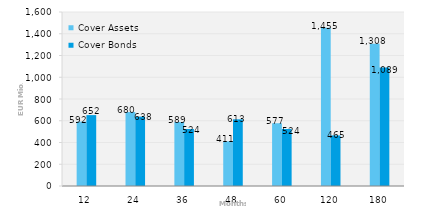
| Category | Cover Assets | Cover Bonds |
|---|---|---|
| 12.0 | 592.052 | 651.8 |
| 24.0 | 680.169 | 637.757 |
| 36.0 | 588.728 | 524.316 |
| 48.0 | 410.767 | 613.159 |
| 60.0 | 576.97 | 524 |
| 120.0 | 1454.859 | 464.957 |
| 180.0 | 1307.546 | 1088.79 |